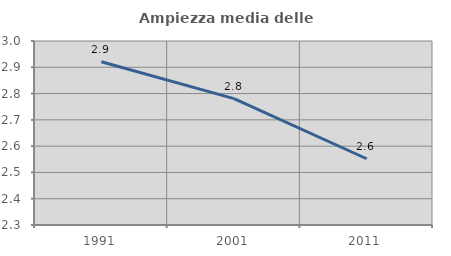
| Category | Ampiezza media delle famiglie |
|---|---|
| 1991.0 | 2.921 |
| 2001.0 | 2.781 |
| 2011.0 | 2.552 |